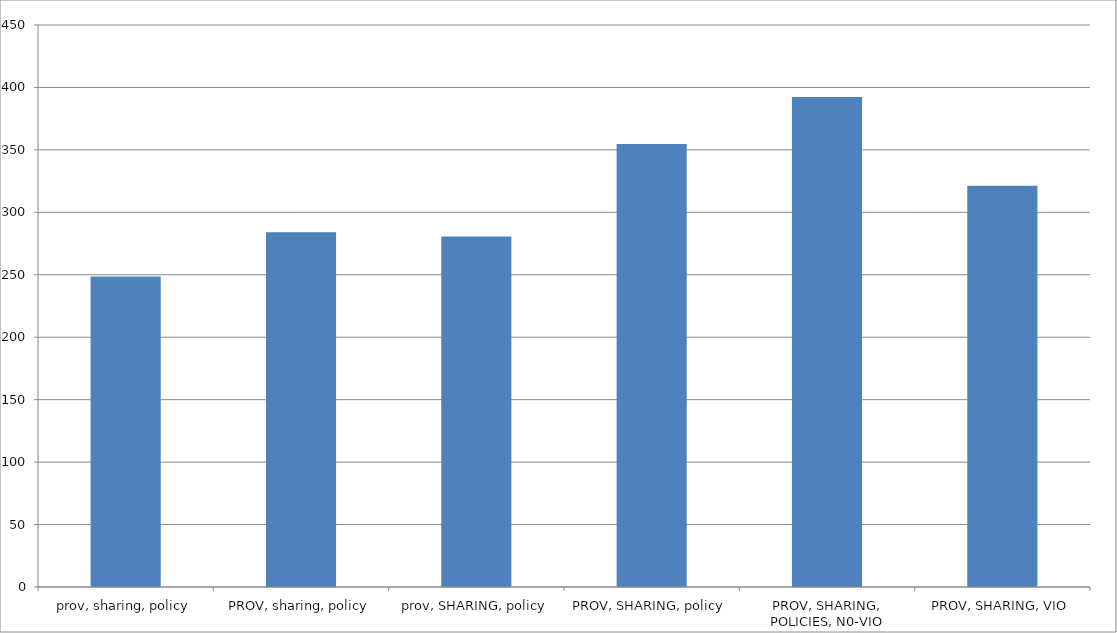
| Category | Series 0 |
|---|---|
| prov, sharing, policy | 248.614 |
| PROV, sharing, policy | 284.021 |
| prov, SHARING, policy | 280.696 |
| PROV, SHARING, policy | 354.8 |
| PROV, SHARING, POLICIES, N0-VIO | 392.26 |
| PROV, SHARING, VIO | 321.204 |